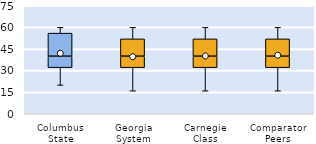
| Category | 25th | 50th | 75th |
|---|---|---|---|
| Columbus State | 32 | 8 | 16 |
| Georgia System | 32 | 8 | 12 |
| Carnegie Class | 32 | 8 | 12 |
| Comparator Peers | 32 | 8 | 12 |